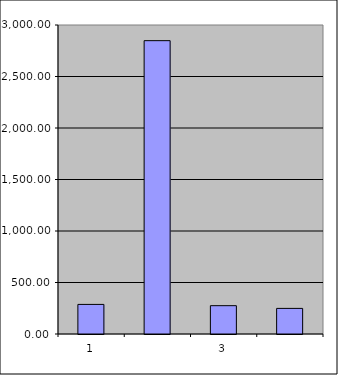
| Category | Series 0 |
|---|---|
| 0 | 287.25 |
| 1 | 2847.914 |
| 2 | 274.894 |
| 3 | 248.513 |